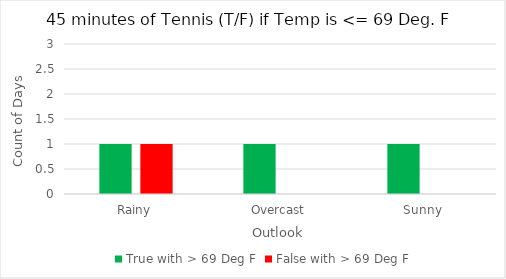
| Category | True with > 69 Deg F | False with > 69 Deg F |
|---|---|---|
| Rainy | 1 | 1 |
| Overcast | 1 | 0 |
| Sunny | 1 | 0 |